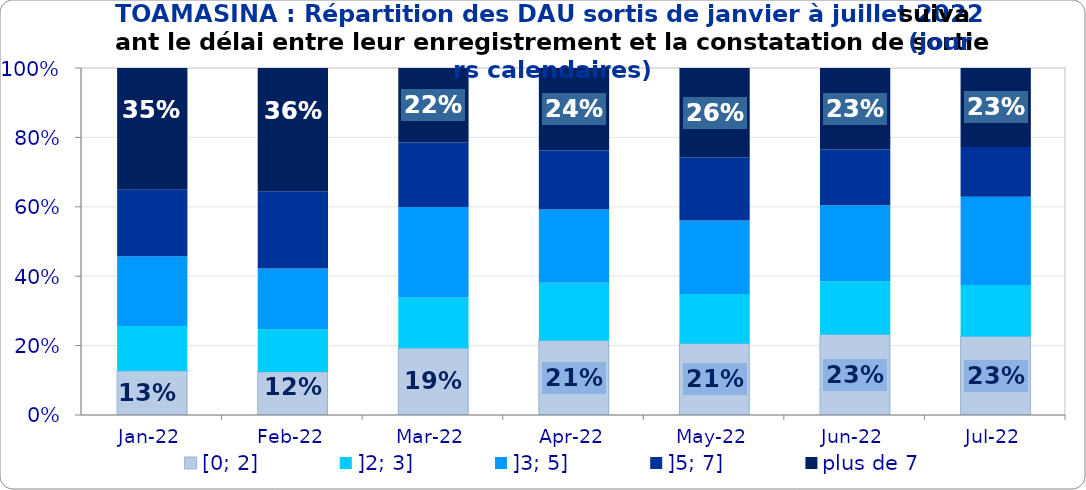
| Category | [0; 2] | ]2; 3] | ]3; 5] | ]5; 7] | plus de 7 |
|---|---|---|---|---|---|
| 2022-01-01 | 0.127 | 0.13 | 0.201 | 0.192 | 0.351 |
| 2022-02-01 | 0.124 | 0.123 | 0.175 | 0.222 | 0.356 |
| 2022-03-01 | 0.192 | 0.146 | 0.261 | 0.186 | 0.215 |
| 2022-04-01 | 0.214 | 0.166 | 0.211 | 0.17 | 0.237 |
| 2022-05-01 | 0.206 | 0.143 | 0.212 | 0.182 | 0.257 |
| 2022-06-01 | 0.232 | 0.153 | 0.219 | 0.16 | 0.235 |
| 2022-07-01 | 0.226 | 0.148 | 0.254 | 0.144 | 0.228 |